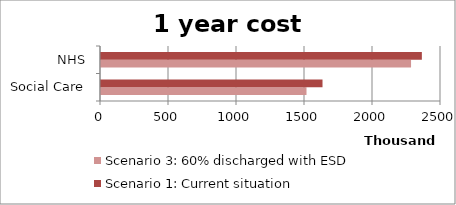
| Category | Scenario 3: 60% discharged with ESD | Scenario 1: Current situation |
|---|---|---|
| 0 | 1511039.46 | 1628776.504 |
| 1 | 2279831.8 | 2359264.81 |